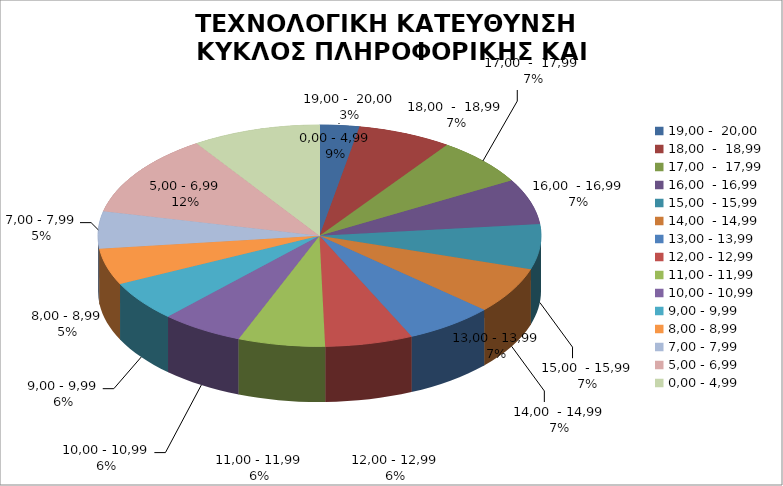
| Category | ΤΕΧΝΟΛΟΓΙΚΗ ΚΑΤΕΥΘΥΝΣΗ ΙΙ - 2010 |
|---|---|
| 19,00 -  20,00 | 2.886 |
| 18,00  -  18,99 | 6.855 |
| 17,00  -  17,99 | 6.933 |
| 16,00  - 16,99 | 6.654 |
| 15,00  - 15,99 | 6.574 |
| 14,00  - 14,99 | 6.763 |
| 13,00 - 13,99 | 6.523 |
| 12,00 - 12,99 | 6.407 |
| 11,00 - 11,99 | 6.342 |
| 10,00 - 10,99 | 6.033 |
| 9,00 - 9,99 | 5.832 |
| 8,00 - 8,99 | 5.331 |
| 7,00 - 7,99 | 5.414 |
| 5,00 - 6,99 | 12.091 |
| 0,00 - 4,99 | 9.362 |